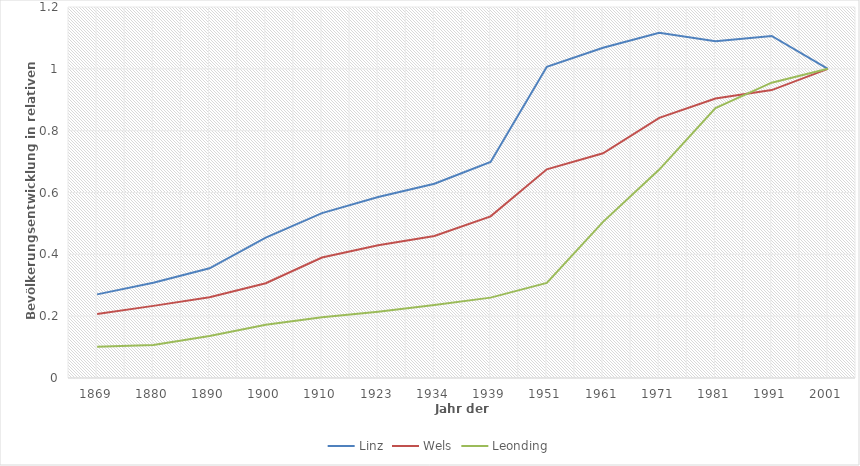
| Category | Linz | Wels | Leonding |
|---|---|---|---|
| 1869 | 0.27 | 0.207 | 0.101 |
| 1880 | 0.308 | 0.233 | 0.107 |
| 1890 | 0.355 | 0.261 | 0.136 |
| 1900 | 0.454 | 0.306 | 0.172 |
| 1910 | 0.533 | 0.39 | 0.197 |
| 1923 | 0.586 | 0.429 | 0.214 |
| 1934 | 0.629 | 0.46 | 0.236 |
| 1939 | 0.698 | 0.523 | 0.26 |
| 1951 | 1.006 | 0.675 | 0.308 |
| 1961 | 1.068 | 0.727 | 0.505 |
| 1971 | 1.117 | 0.842 | 0.674 |
| 1981 | 1.089 | 0.904 | 0.873 |
| 1991 | 1.106 | 0.931 | 0.955 |
| 2001 | 1 | 1 | 1 |